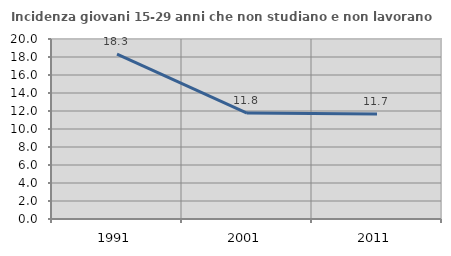
| Category | Incidenza giovani 15-29 anni che non studiano e non lavorano  |
|---|---|
| 1991.0 | 18.331 |
| 2001.0 | 11.765 |
| 2011.0 | 11.679 |